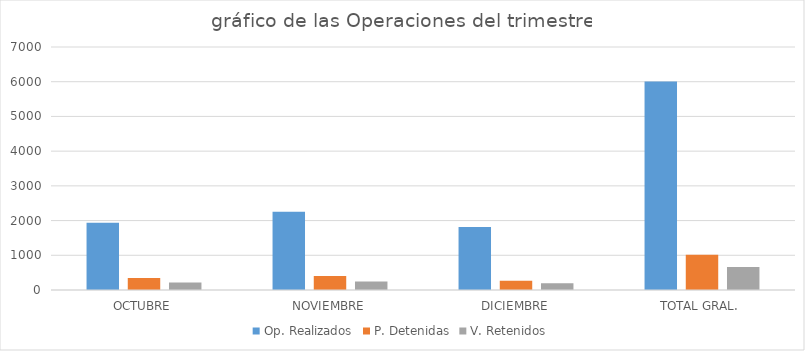
| Category | Op. Realizados | P. Detenidas | V. Retenidos |
|---|---|---|---|
| OCTUBRE | 1940 | 344 | 217 |
| NOVIEMBRE | 2251 | 401 | 246 |
| DICIEMBRE | 1818 | 269 | 196 |
| TOTAL GRAL. | 6009 | 1014 | 659 |